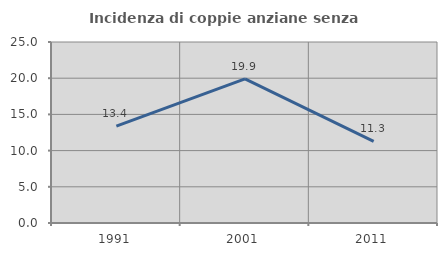
| Category | Incidenza di coppie anziane senza figli  |
|---|---|
| 1991.0 | 13.389 |
| 2001.0 | 19.912 |
| 2011.0 | 11.282 |